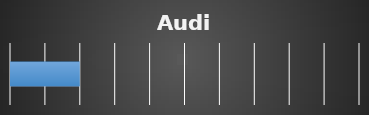
| Category | Series 0 |
|---|---|
| 0 | 20 |